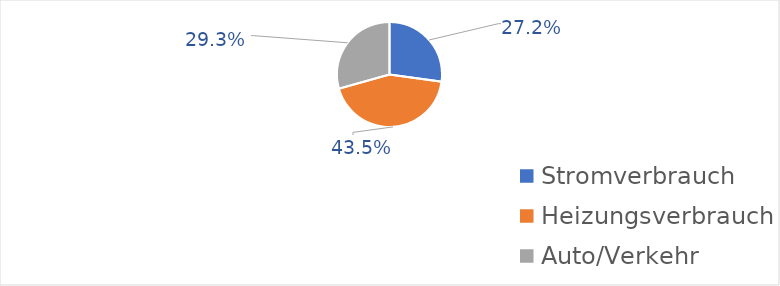
| Category | Series 0 |
|---|---|
| Stromverbrauch  | 0.272 |
| Heizungsverbrauch  | 0.435 |
| Auto/Verkehr | 0.293 |